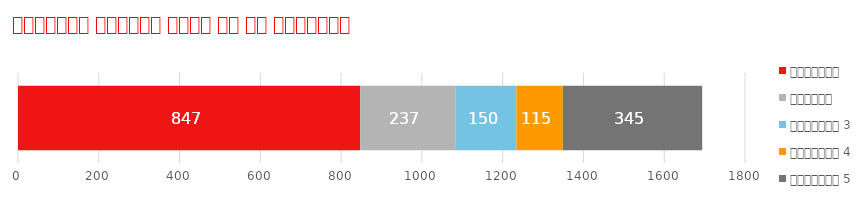
| Category | बाइकिंग | तैराकी | गतिविधि 3 | गतिविधि 4 | गतिविधि 5 |
|---|---|---|---|---|---|
| गतिविधि ट्रैकर | 847 | 237 | 150 | 115 | 345 |